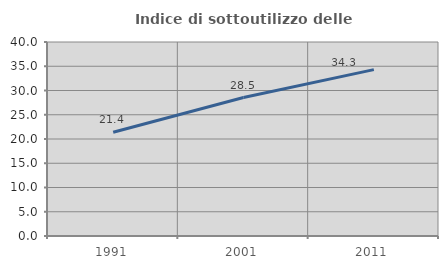
| Category | Indice di sottoutilizzo delle abitazioni  |
|---|---|
| 1991.0 | 21.398 |
| 2001.0 | 28.548 |
| 2011.0 | 34.298 |